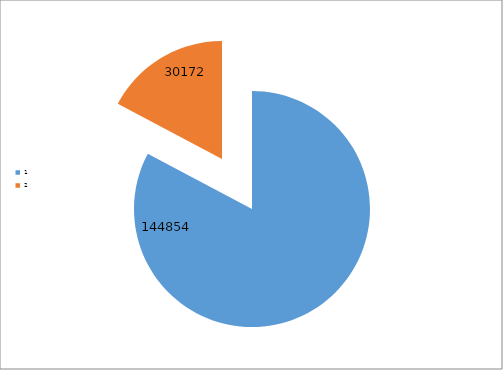
| Category | Series 0 |
|---|---|
| 0 | 144854 |
| 1 | 30172 |